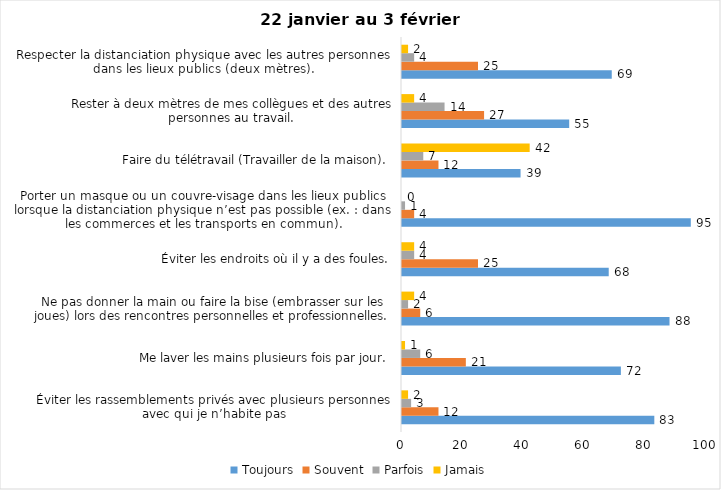
| Category | Toujours | Souvent | Parfois | Jamais |
|---|---|---|---|---|
| Éviter les rassemblements privés avec plusieurs personnes avec qui je n’habite pas | 83 | 12 | 3 | 2 |
| Me laver les mains plusieurs fois par jour. | 72 | 21 | 6 | 1 |
| Ne pas donner la main ou faire la bise (embrasser sur les joues) lors des rencontres personnelles et professionnelles. | 88 | 6 | 2 | 4 |
| Éviter les endroits où il y a des foules. | 68 | 25 | 4 | 4 |
| Porter un masque ou un couvre-visage dans les lieux publics lorsque la distanciation physique n’est pas possible (ex. : dans les commerces et les transports en commun). | 95 | 4 | 1 | 0 |
| Faire du télétravail (Travailler de la maison). | 39 | 12 | 7 | 42 |
| Rester à deux mètres de mes collègues et des autres personnes au travail. | 55 | 27 | 14 | 4 |
| Respecter la distanciation physique avec les autres personnes dans les lieux publics (deux mètres). | 69 | 25 | 4 | 2 |